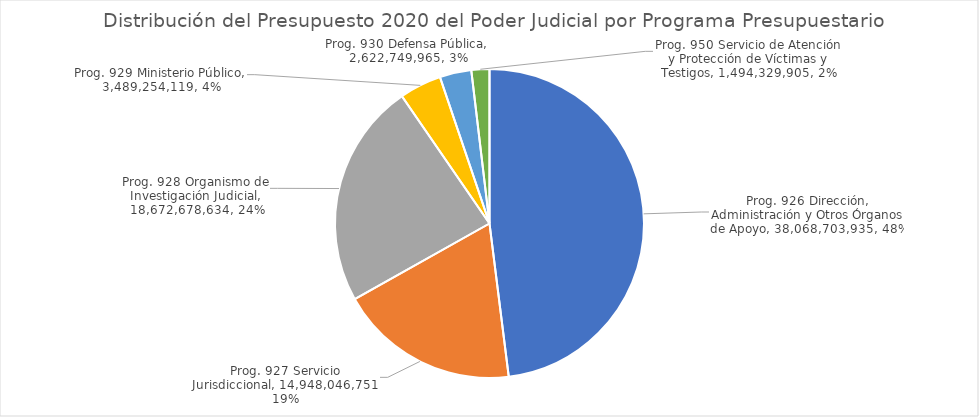
| Category | Series 0 | Series 1 |
|---|---|---|
| Prog. 926 Dirección, Administración y Otros Órganos de Apoyo | 38068703935 | 0.48 |
| Prog. 927 Servicio Jurisdiccional | 14948046751 | 0.189 |
| Prog. 928 Organismo de Investigación Judicial | 18672678634 | 0.235 |
| Prog. 929 Ministerio Público | 3489254119 | 0.044 |
| Prog. 930 Defensa Pública | 2622749965 | 0.033 |
| Prog. 950 Servicio de Atención y Protección de Víctimas y Testigos | 1494329905 | 0.019 |